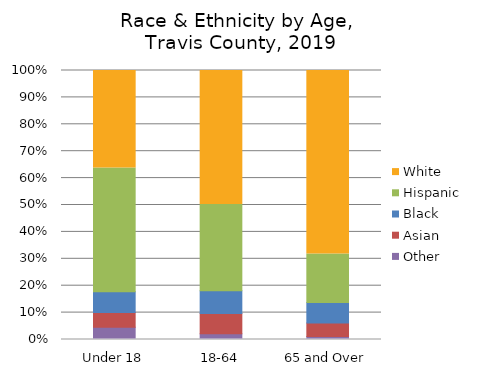
| Category | Other | Asian | Black | Hispanic | White |
|---|---|---|---|---|---|
| Under 18 | 0.045 | 0.055 | 0.077 | 0.46 | 0.362 |
| 18-64 | 0.021 | 0.075 | 0.084 | 0.321 | 0.498 |
| 65 and Over | 0.011 | 0.051 | 0.076 | 0.181 | 0.682 |